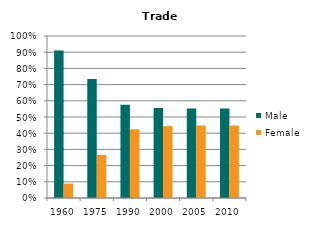
| Category | Male | Female |
|---|---|---|
| 1960.0 | 0.911 | 0.089 |
| 1975.0 | 0.734 | 0.266 |
| 1990.0 | 0.576 | 0.424 |
| 2000.0 | 0.556 | 0.444 |
| 2005.0 | 0.552 | 0.448 |
| 2010.0 | 0.552 | 0.448 |